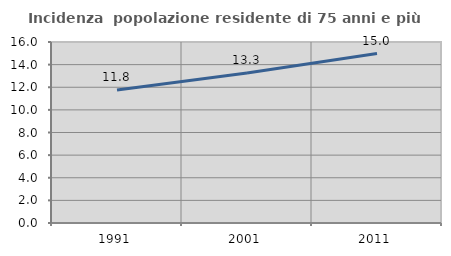
| Category | Incidenza  popolazione residente di 75 anni e più |
|---|---|
| 1991.0 | 11.758 |
| 2001.0 | 13.251 |
| 2011.0 | 14.98 |